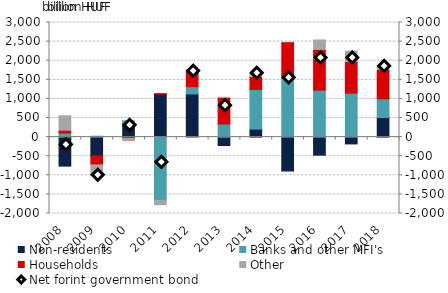
| Category | Non-residents | Banks and other MFI's | Households | Other |
|---|---|---|---|---|
| 2008.0 | -759.65 | 107.753 | 57.047 | 392.2 |
| 2009.0 | -491.4 | 23.556 | -236.156 | -293.241 |
| 2010.0 | 358.869 | 68.381 | -32.221 | -87.487 |
| 2011.0 | 1124.084 | -1656.51 | 11.985 | -139.476 |
| 2012.0 | 1130.805 | 189.835 | 433.858 | -29.175 |
| 2013.0 | -219.704 | 342.911 | 675.773 | 24.837 |
| 2014.0 | 209.723 | 1035.767 | 320.976 | 103.968 |
| 2015.0 | -901.505 | 1614.165 | 857.987 | -21.991 |
| 2016.0 | -472.926 | 1229.477 | 1051.766 | 261.126 |
| 2017.0 | -178.442 | 1151.054 | 813.833 | 286.152 |
| 2018.0 | 511.971 | 491.805 | 738.961 | 108.119 |